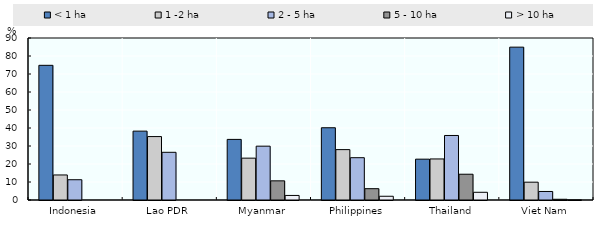
| Category | < 1 ha | 1 -2 ha | 2 - 5 ha | 5 - 10 ha | > 10 ha |
|---|---|---|---|---|---|
| Indonesia | 74.82 | 13.915 | 11.266 | 0 | 0 |
| Lao PDR | 38.263 | 35.24 | 26.497 | 0 | 0 |
| Myanmar | 33.667 | 23.251 | 29.906 | 10.648 | 2.528 |
| Philippines | 40.141 | 27.99 | 23.504 | 6.286 | 2.079 |
| Thailand | 22.688 | 22.809 | 35.846 | 14.318 | 4.287 |
| Viet Nam | 84.913 | 9.899 | 4.735 | 0.4 | 0.053 |